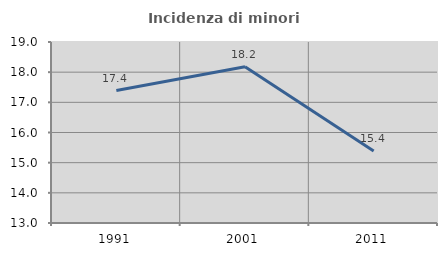
| Category | Incidenza di minori stranieri |
|---|---|
| 1991.0 | 17.391 |
| 2001.0 | 18.182 |
| 2011.0 | 15.385 |